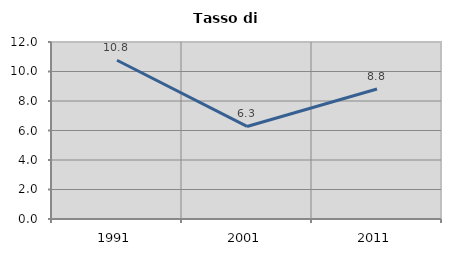
| Category | Tasso di disoccupazione   |
|---|---|
| 1991.0 | 10.765 |
| 2001.0 | 6.275 |
| 2011.0 | 8.81 |